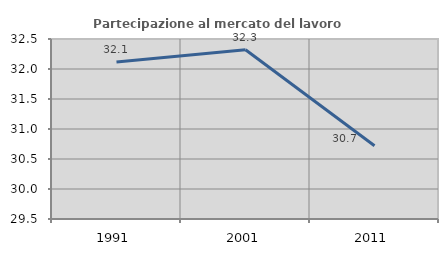
| Category | Partecipazione al mercato del lavoro  femminile |
|---|---|
| 1991.0 | 32.118 |
| 2001.0 | 32.32 |
| 2011.0 | 30.721 |